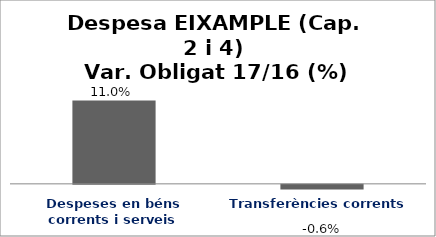
| Category | Series 0 |
|---|---|
| Despeses en béns corrents i serveis | 0.11 |
| Transferències corrents | -0.006 |